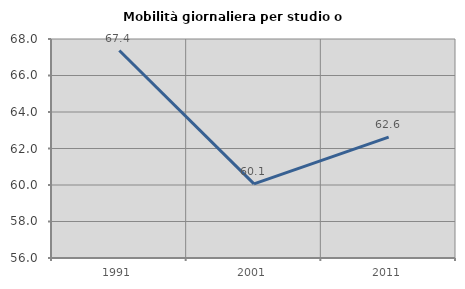
| Category | Mobilità giornaliera per studio o lavoro |
|---|---|
| 1991.0 | 67.367 |
| 2001.0 | 60.062 |
| 2011.0 | 62.624 |